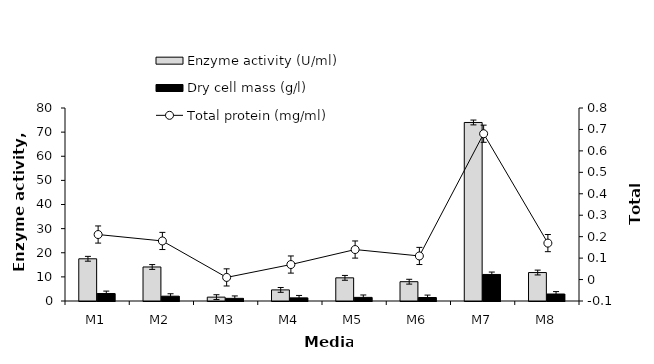
| Category | Enzyme activity (U/ml) | Dry cell mass (g/l) |
|---|---|---|
| M1 | 17.5 | 3.1 |
| M2 | 14.1 | 2 |
| M3 | 1.6 | 1.1 |
| M4 | 4.6 | 1.3 |
| M5 | 9.6 | 1.5 |
| M6 | 8 | 1.45 |
| M7 | 74 | 11 |
| M8 | 11.8 | 2.9 |